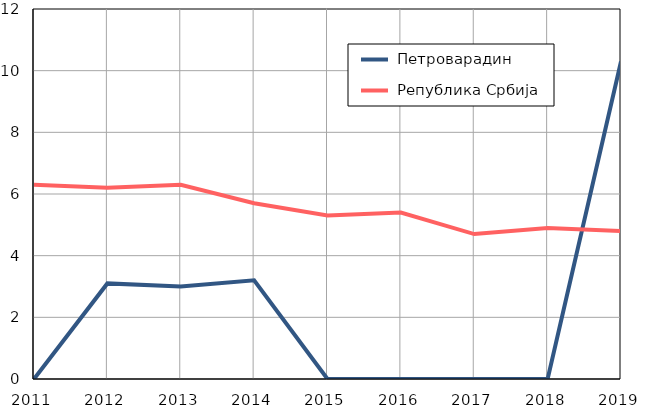
| Category |  Петроварадин |  Република Србија |
|---|---|---|
| 2011.0 | 0 | 6.3 |
| 2012.0 | 3.1 | 6.2 |
| 2013.0 | 3 | 6.3 |
| 2014.0 | 3.2 | 5.7 |
| 2015.0 | 0 | 5.3 |
| 2016.0 | 0 | 5.4 |
| 2017.0 | 0 | 4.7 |
| 2018.0 | 0 | 4.9 |
| 2019.0 | 10.3 | 4.8 |